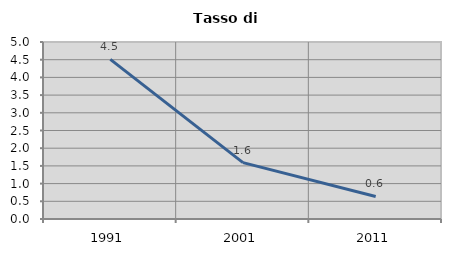
| Category | Tasso di disoccupazione   |
|---|---|
| 1991.0 | 4.509 |
| 2001.0 | 1.592 |
| 2011.0 | 0.638 |